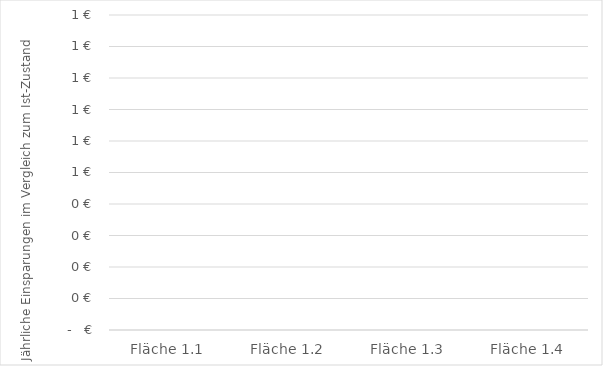
| Category | Series 0 |
|---|---|
| Fläche 1.1 | 0 |
| Fläche 1.2 | 0 |
| Fläche 1.3 | 0 |
| Fläche 1.4 | 0 |